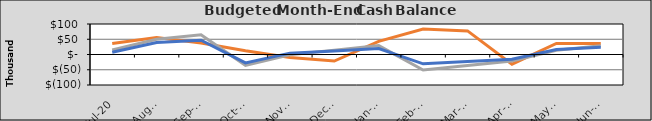
| Category | Final Cash | Original Cash | Revised Cash |
|---|---|---|---|
| 2020-07-01 | 35969.262 | 14944.386 | 7475.045 |
| 2020-08-01 | 55357.32 | 49817.897 | 39364.995 |
| 2020-09-01 | 37853.527 | 64762.284 | 46840.04 |
| 2020-10-02 | 12006.639 | -35493.33 | -27494.916 |
| 2020-11-02 | -10164.098 | -619.819 | 4395.034 |
| 2020-12-03 | -21367.196 | 14324.567 | 11870.079 |
| 2021-01-03 | 43145.736 | 29268.953 | 19345.124 |
| 2021-02-03 | 83376.944 | -51057.535 | -30574.926 |
| 2021-03-06 | 77335.151 | -36113.149 | -23099.881 |
| 2021-04-06 | -31821.917 | -21168.763 | -15624.836 |
| 2021-05-07 | 36431.196 | 13704.748 | 16265.113 |
| 2021-06-07 | 35932.006 | 28646.455 | 23738.214 |